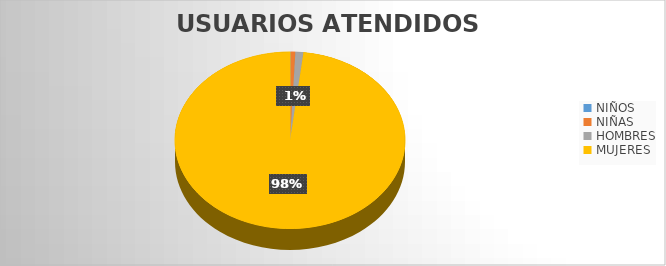
| Category | USUARIOS ATENDIDOS  |
|---|---|
| NIÑOS  | 1 |
| NIÑAS | 9 |
| HOMBRES | 15 |
| MUJERES | 1316 |